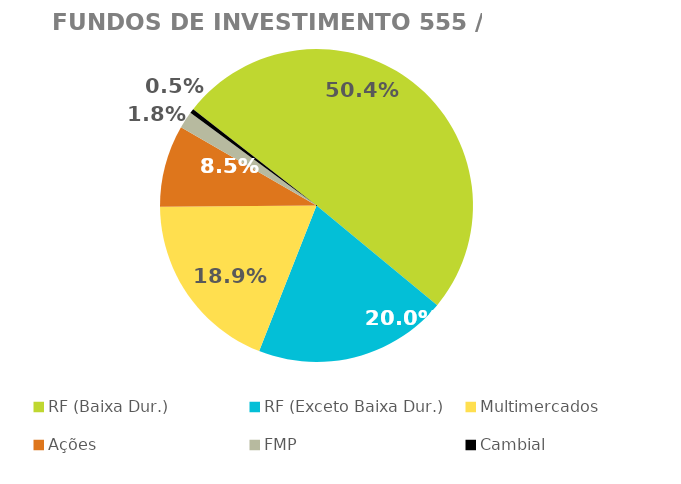
| Category | Fundos de Investimento 555 / FMP |
|---|---|
| RF (Baixa Dur.) | 0.504 |
| RF (Exceto Baixa Dur.) | 0.2 |
| Multimercados | 0.189 |
| Ações | 0.085 |
| FMP | 0.018 |
| Cambial | 0.005 |